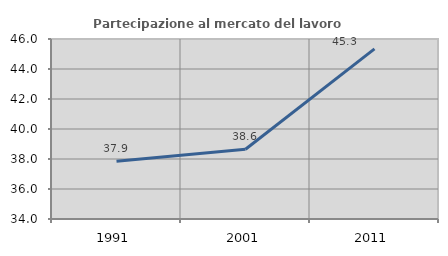
| Category | Partecipazione al mercato del lavoro  femminile |
|---|---|
| 1991.0 | 37.851 |
| 2001.0 | 38.648 |
| 2011.0 | 45.34 |